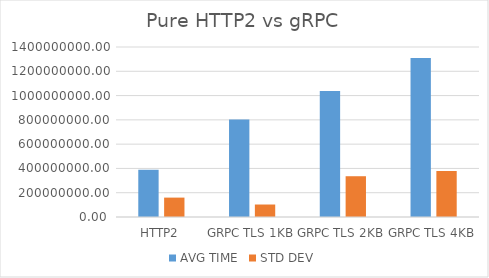
| Category | AVG TIME | STD DEV |
|---|---|---|
| HTTP2 | 388431785.62 | 159719326.999 |
| GRPC TLS 1KB | 802249902.06 | 102836694.771 |
| GRPC TLS 2KB | 1036732459.12 | 335791223.836 |
| GRPC TLS 4KB | 1308651428.02 | 377960413.614 |